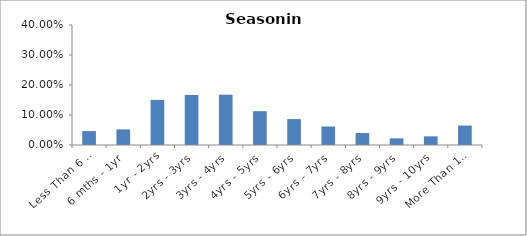
| Category | Series 0 |
|---|---|
| Less Than 6 mths | 0.046 |
| 6 mths - 1yr | 0.052 |
| 1yr - 2yrs | 0.15 |
| 2yrs - 3yrs | 0.167 |
| 3yrs - 4yrs | 0.168 |
| 4yrs - 5yrs | 0.113 |
| 5yrs - 6yrs | 0.086 |
| 6yrs - 7yrs | 0.062 |
| 7yrs - 8yrs | 0.04 |
| 8yrs - 9yrs | 0.022 |
| 9yrs - 10yrs | 0.029 |
| More Than 10yrs | 0.065 |